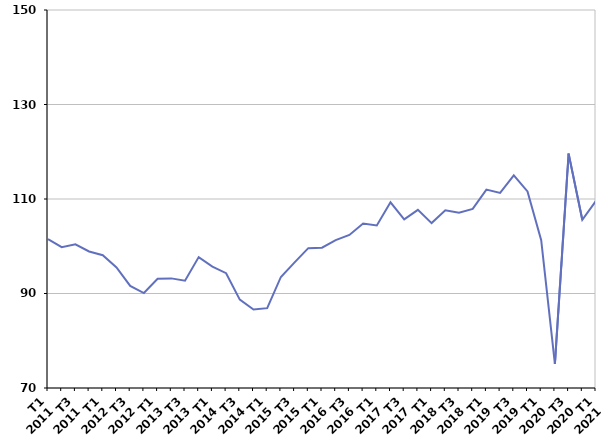
| Category | Reprise d'emploi déclarée |
|---|---|
| T1
2011 | 101.5 |
| T2
2011 | 99.8 |
| T3
2011 | 100.4 |
| T4
2011 | 98.9 |
| T1
2012 | 98.1 |
| T2
2012 | 95.5 |
| T3
2012 | 91.6 |
| T4
2012 | 90.1 |
| T1
2013 | 93.1 |
| T2
2013 | 93.2 |
| T3
2013 | 92.7 |
| T4
2013 | 97.7 |
| T1
2014 | 95.7 |
| T2
2014 | 94.3 |
| T3
2014 | 88.7 |
| T4
2014 | 86.6 |
| T1
2015 | 86.9 |
| T2
2015 | 93.5 |
| T3
2015 | 96.6 |
| T4
2015 | 99.6 |
| T1
2016 | 99.7 |
| T2
2016 | 101.3 |
| T3
2016 | 102.4 |
| T4
2016 | 104.8 |
| T1
2017 | 104.4 |
| T2
2017 | 109.3 |
| T3
2017 | 105.7 |
| T4
2017 | 107.7 |
| T1
2018 | 104.9 |
| T2
2018 | 107.6 |
| T3
2018 | 107.1 |
| T4
2018 | 107.9 |
| T1
2019 | 112 |
| T2
2019 | 111.3 |
| T3
2019 | 115 |
| T4
2019 | 111.6 |
| T1
2020 | 101.3 |
| T2
2020 | 75.1 |
| T3
2020 | 119.6 |
| T4
2020 | 105.6 |
| T1
2021 | 109.6 |